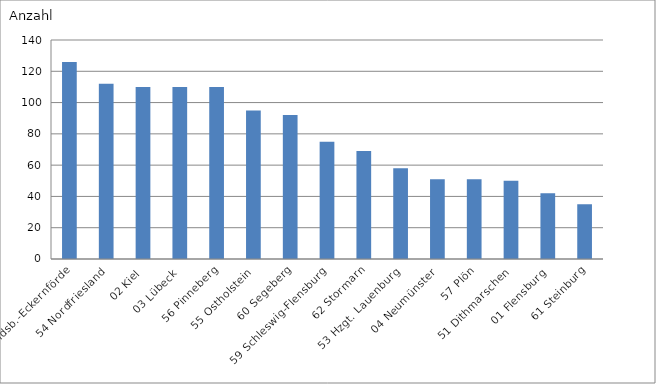
| Category | 58 Rendsb.-Eckernförde |
|---|---|
| 58 Rendsb.-Eckernförde | 126 |
| 54 Nordfriesland | 112 |
| 02 Kiel | 110 |
| 03 Lübeck | 110 |
| 56 Pinneberg | 110 |
| 55 Ostholstein | 95 |
| 60 Segeberg | 92 |
| 59 Schleswig-Flensburg | 75 |
| 62 Stormarn | 69 |
| 53 Hzgt. Lauenburg | 58 |
| 04 Neumünster | 51 |
| 57 Plön | 51 |
| 51 Dithmarschen | 50 |
| 01 Flensburg | 42 |
| 61 Steinburg | 35 |